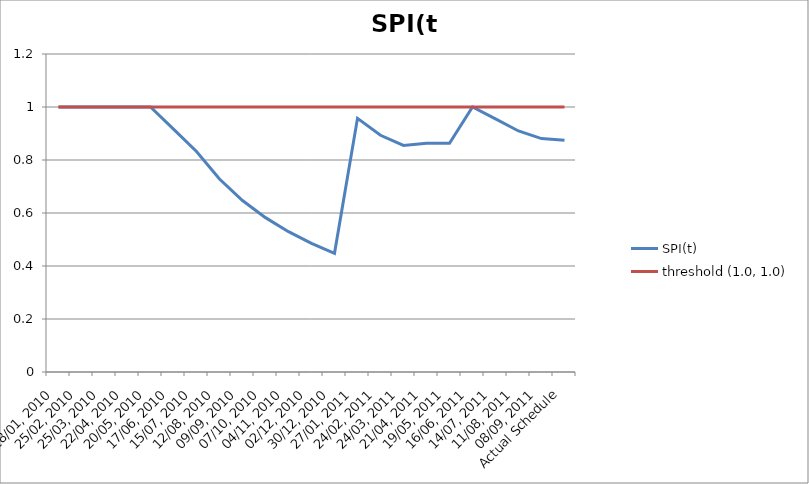
| Category | SPI(t) | threshold (1.0, 1.0) |
|---|---|---|
| 28/01, 2010 | 1 | 1 |
| 25/02, 2010 | 1 | 1 |
| 25/03, 2010 | 1 | 1 |
| 22/04, 2010 | 1 | 1 |
| 20/05, 2010 | 1 | 1 |
| 17/06, 2010 | 0.917 | 1 |
| 15/07, 2010 | 0.832 | 1 |
| 12/08, 2010 | 0.728 | 1 |
| 09/09, 2010 | 0.647 | 1 |
| 07/10, 2010 | 0.582 | 1 |
| 04/11, 2010 | 0.53 | 1 |
| 02/12, 2010 | 0.485 | 1 |
| 30/12, 2010 | 0.448 | 1 |
| 27/01, 2011 | 0.957 | 1 |
| 24/02, 2011 | 0.893 | 1 |
| 24/03, 2011 | 0.855 | 1 |
| 21/04, 2011 | 0.864 | 1 |
| 19/05, 2011 | 0.863 | 1 |
| 16/06, 2011 | 1 | 1 |
| 14/07, 2011 | 0.955 | 1 |
| 11/08, 2011 | 0.91 | 1 |
| 08/09, 2011 | 0.881 | 1 |
| Actual Schedule | 0.874 | 1 |